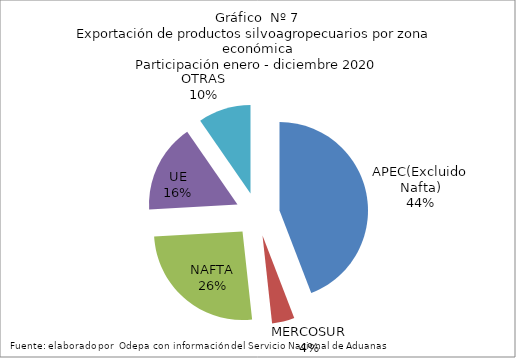
| Category | Series 0 |
|---|---|
| APEC(Excluido Nafta) | 6931815.524 |
| MERCOSUR | 644247.035 |
| NAFTA | 4057737.414 |
| UE | 2552766.537 |
| OTRAS | 1509875.49 |